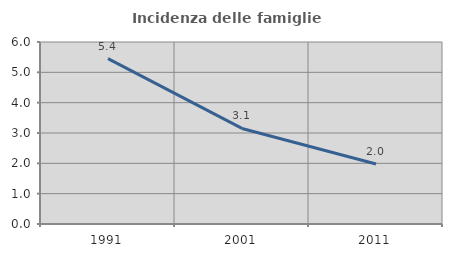
| Category | Incidenza delle famiglie numerose |
|---|---|
| 1991.0 | 5.449 |
| 2001.0 | 3.15 |
| 2011.0 | 1.979 |